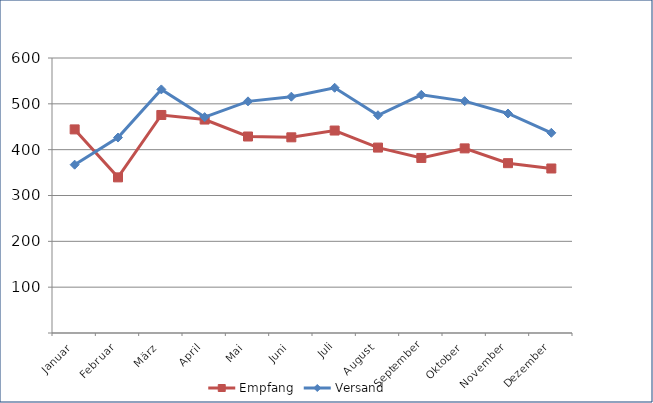
| Category | Empfang | Versand |
|---|---|---|
| Januar | 444.218 | 367.237 |
| Februar | 339.564 | 426.445 |
| März | 475.69 | 531.445 |
| April | 465.704 | 471.047 |
| Mai | 428.721 | 505.409 |
| Juni | 426.924 | 515.619 |
| Juli | 441.717 | 535.064 |
| August | 404.531 | 475.086 |
| September | 381.954 | 519.734 |
| Oktober | 402.792 | 505.88 |
| November | 370.559 | 478.912 |
| Dezember | 358.914 | 436.787 |